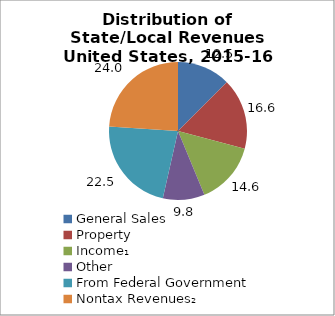
| Category | Series 0 |
|---|---|
| General Sales | 12.493 |
| Property | 16.628 |
| Income₁ | 14.644 |
| Other | 9.774 |
| From Federal Government | 22.482 |
| Nontax Revenues₂ | 23.979 |